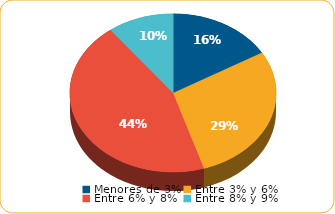
| Category | Series 0 |
|---|---|
| Menores de 3% | 2096.3 |
| Entre 3% y 6% | 3641.3 |
| Entre 6% y 8% | 5650.3 |
| Entre 8% y 9% | 1317.4 |